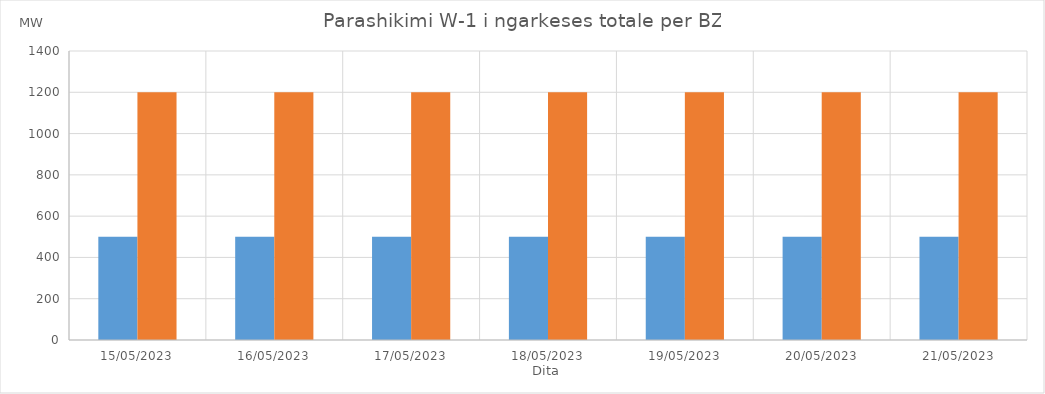
| Category | Min (MW) | Max (MW) |
|---|---|---|
| 15/05/2023 | 500 | 1200 |
| 16/05/2023 | 500 | 1200 |
| 17/05/2023 | 500 | 1200 |
| 18/05/2023 | 500 | 1200 |
| 19/05/2023 | 500 | 1200 |
| 20/05/2023 | 500 | 1200 |
| 21/05/2023 | 500 | 1200 |